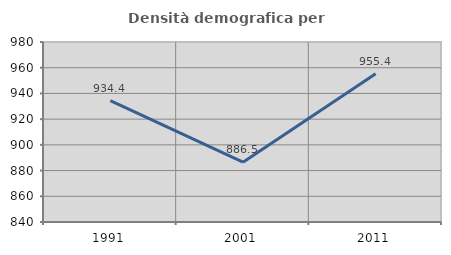
| Category | Densità demografica |
|---|---|
| 1991.0 | 934.412 |
| 2001.0 | 886.493 |
| 2011.0 | 955.376 |